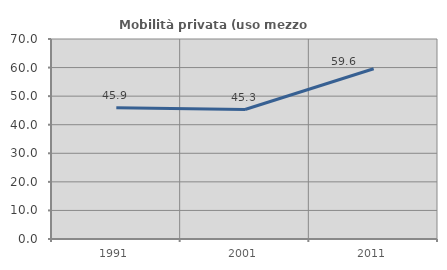
| Category | Mobilità privata (uso mezzo privato) |
|---|---|
| 1991.0 | 45.897 |
| 2001.0 | 45.32 |
| 2011.0 | 59.569 |